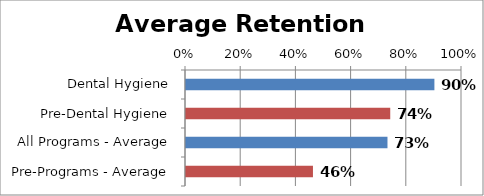
| Category | Series 0 |
|---|---|
| Dental Hygiene | 0.9 |
| Pre-Dental Hygiene | 0.74 |
| All Programs - Average | 0.73 |
| Pre-Programs - Average | 0.46 |